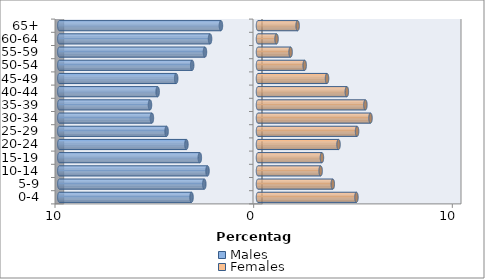
| Category | Males | Females |
|---|---|---|
| 0-4 | -3.346 | 4.955 |
| 5-9 | -2.703 | 3.764 |
| 10-14 | -2.542 | 3.153 |
| 15-19 | -2.928 | 3.218 |
| 20-24 | -3.604 | 4.054 |
| 25-29 | -4.601 | 4.987 |
| 30-34 | -5.341 | 5.663 |
| 35-39 | -5.438 | 5.405 |
| 40-44 | -5.051 | 4.472 |
| 45-49 | -4.118 | 3.475 |
| 50-54 | -3.314 | 2.349 |
| 55-59 | -2.671 | 1.641 |
| 60-64 | -2.413 | 0.933 |
| 65+ | -1.866 | 1.995 |